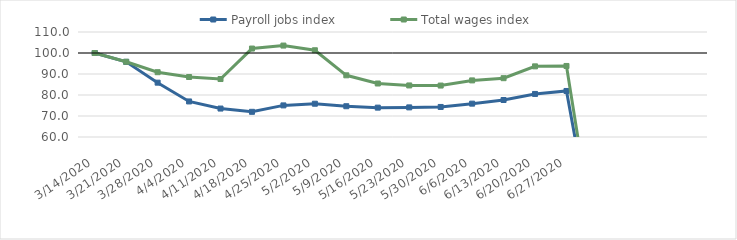
| Category | Payroll jobs index | Total wages index |
|---|---|---|
| 14/03/2020 | 100 | 100 |
| 21/03/2020 | 95.796 | 95.823 |
| 28/03/2020 | 85.871 | 90.862 |
| 04/04/2020 | 76.933 | 88.565 |
| 11/04/2020 | 73.547 | 87.605 |
| 18/04/2020 | 71.99 | 102.117 |
| 25/04/2020 | 75.046 | 103.542 |
| 02/05/2020 | 75.846 | 101.309 |
| 09/05/2020 | 74.656 | 89.372 |
| 16/05/2020 | 73.982 | 85.476 |
| 23/05/2020 | 74.102 | 84.553 |
| 30/05/2020 | 74.304 | 84.499 |
| 06/06/2020 | 75.879 | 86.951 |
| 13/06/2020 | 77.614 | 88.009 |
| 20/06/2020 | 80.501 | 93.642 |
| 27/06/2020 | 81.919 | 93.825 |